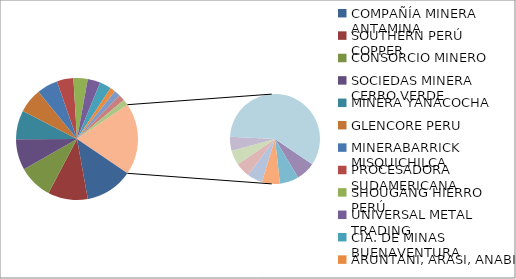
| Category | Series 0 | Series 1 |
|---|---|---|
| COMPAÑÍA MINERA ANTAMINA | 3384338 |  |
| SOUTHERN PERÚ COPPER | 2829021 |  |
| CONSORCIO MINERO | 2418716 |  |
| SOCIEDAS MINERA CERRO VERDE | 2181883 |  |
| MINERA YANACOCHA | 2049535 |  |
| GLENCORE PERU | 1744538 |  |
| MINERABARRICK MISQUICHILCA | 1487193 |  |
| PROCESADORA SUDAMERICANA | 1171696 |  |
| SHOUGANG HIERRO PERÚ | 1011816 |  |
| UNIVERSAL METAL TRADING | 901181 |  |
| CÍA. DE MINAS BUENAVENTURA | 825916 |  |
| ARUNTANI, ARASI, ANABI | 362020 |  |
| SOCIEDAD MINERA RINCONADA | 448068 |  |
| GOLD FIELDS LA CIMA | 427424 |  |
| XSTRATA TINTAYA | 420203 |  |
| LOUIS DREYFUS PERÚ | 351400 |  |
| MINERA SUYAMARCA | 347062 |  |
| NUNERALES DEL SUR | 328548 |  |
| COMERCIALIZADORA TAMBO REAL | 279697 |  |
| CIA. MIN. AURIFERA SANTA ROSA | 270041 |  |
| VOTORANTIM METAIS | 267836 |  |
| MINERA AURÍFERA RETAMAS | 256055 |  |
| Empresas 25 +++ | 2984080 |  |